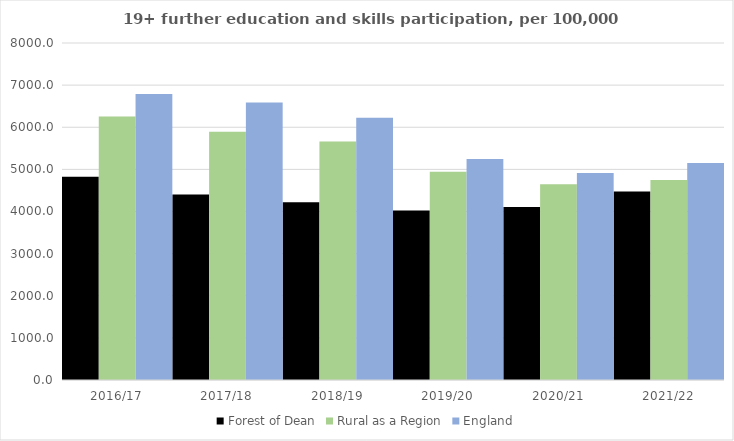
| Category | Forest of Dean | Rural as a Region | England |
|---|---|---|---|
| 2016/17 | 4824 | 6253.401 | 6788 |
| 2017/18 | 4403 | 5892.029 | 6588 |
| 2018/19 | 4222 | 5661.873 | 6227 |
| 2019/20 | 4024 | 4943.801 | 5244 |
| 2020/21 | 4108 | 4646.727 | 4913 |
| 2021/22 | 4473 | 4747.049 | 5151 |